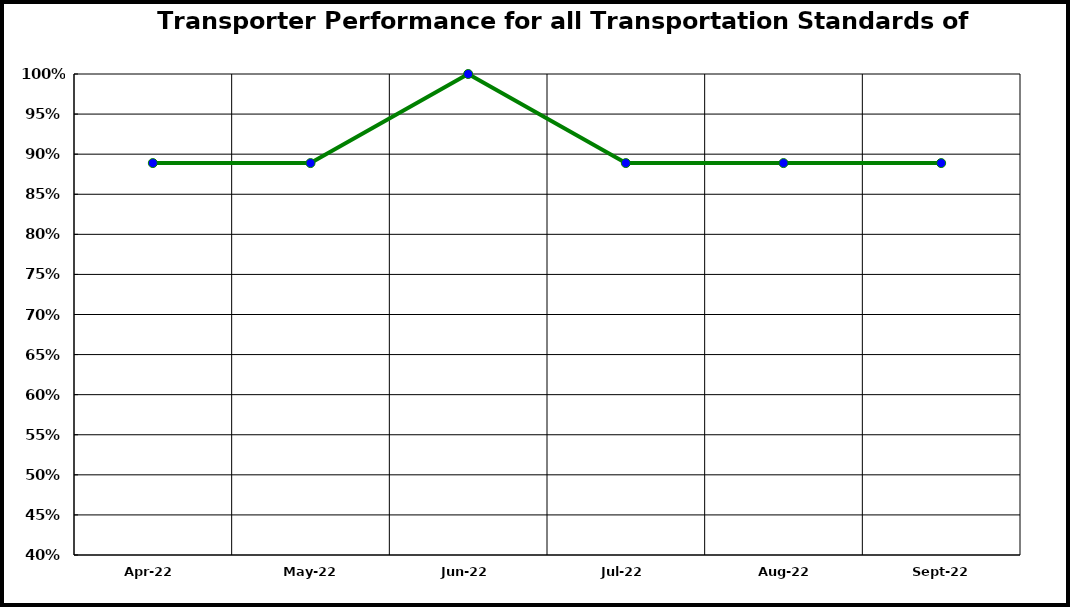
| Category | Performance |
|---|---|
| 2022-04-01 | 0.889 |
| 2022-05-01 | 0.889 |
| 2022-06-01 | 1 |
| 2022-07-01 | 0.889 |
| 2022-08-01 | 0.889 |
| 2022-09-01 | 0.889 |